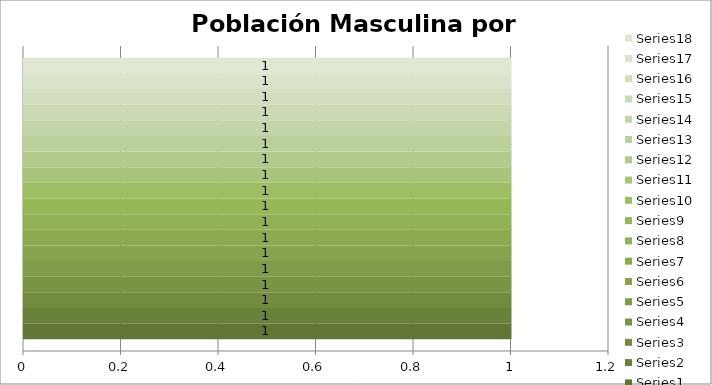
| Category | Series 0 | Series 1 | Series 2 | Series 3 | Series 4 | Series 5 | Series 6 | Series 7 | Series 8 | Series 9 | Series 10 | Series 11 | Series 12 | Series 13 | Series 14 | Series 15 | Series 16 | Series 17 |
|---|---|---|---|---|---|---|---|---|---|---|---|---|---|---|---|---|---|---|
| 0 | 1 | 1 | 1 | 1 | 1 | 1 | 1 | 1 | 1 | 1 | 1 | 1 | 1 | 1 | 1 | 1 | 1 | 1 |